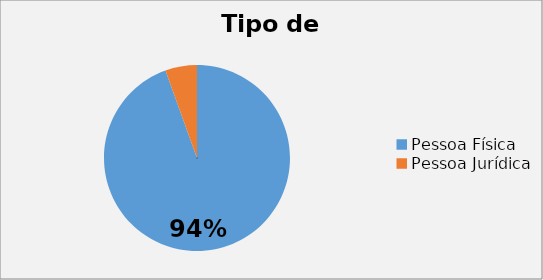
| Category | 94,49% |
|---|---|
| Pessoa Física | 0.945 |
| Pessoa Jurídica | 0.055 |